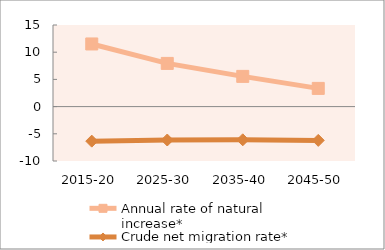
| Category | Annual rate of natural increase* | Crude net migration rate* |
|---|---|---|
| 2015-20 | 11.514 | -6.351 |
| 2025-30 | 7.94 | -6.142 |
| 2035-40 | 5.554 | -6.103 |
| 2045-50 | 3.346 | -6.209 |